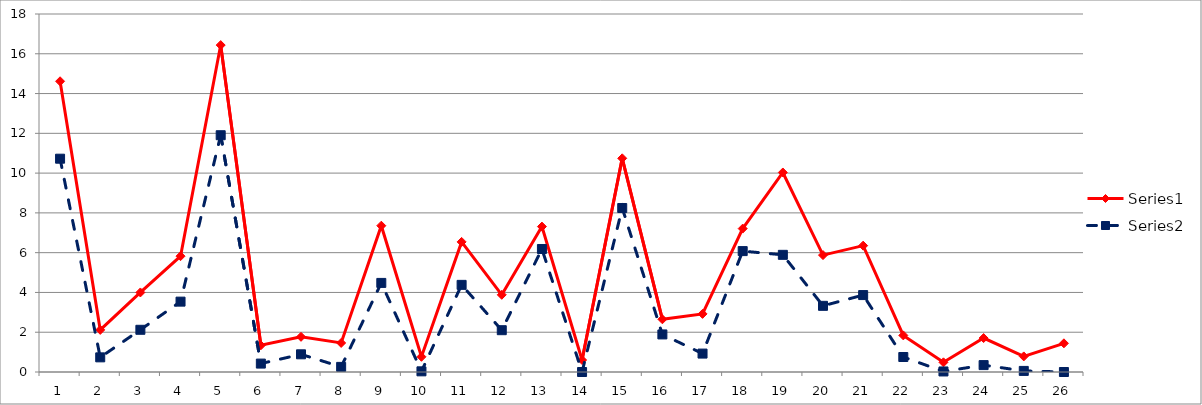
| Category | Series 0 | Series 1 |
|---|---|---|
| 0 | 14.616 | 10.724 |
| 1 | 2.116 | 0.736 |
| 2 | 3.999 | 2.122 |
| 3 | 5.823 | 3.538 |
| 4 | 16.437 | 11.905 |
| 5 | 1.342 | 0.423 |
| 6 | 1.769 | 0.89 |
| 7 | 1.461 | 0.257 |
| 8 | 7.356 | 4.479 |
| 9 | 0.765 | 0.034 |
| 10 | 6.542 | 4.381 |
| 11 | 3.881 | 2.102 |
| 12 | 7.311 | 6.184 |
| 13 | 0.604 | 0 |
| 14 | 10.743 | 8.245 |
| 15 | 2.65 | 1.889 |
| 16 | 2.922 | 0.926 |
| 17 | 7.211 | 6.079 |
| 18 | 10.032 | 5.891 |
| 19 | 5.878 | 3.327 |
| 20 | 6.354 | 3.868 |
| 21 | 1.841 | 0.754 |
| 22 | 0.487 | 0.027 |
| 23 | 1.706 | 0.347 |
| 24 | 0.784 | 0.054 |
| 25 | 1.442 | 0 |